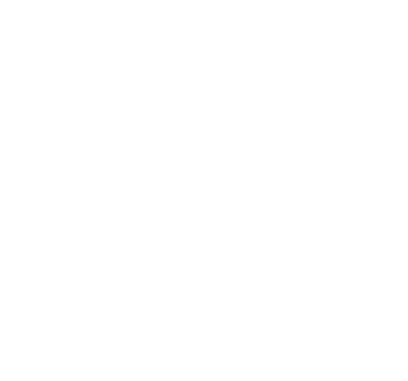
| Category | Series 0 |
|---|---|
| Total Assets | 0 |
| Total Debts | 0 |
| Net Worth | 0 |